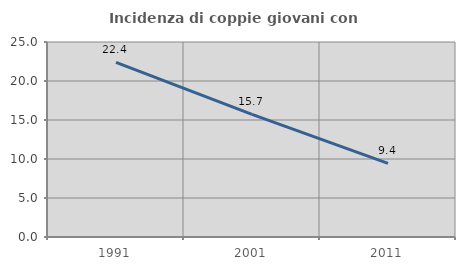
| Category | Incidenza di coppie giovani con figli |
|---|---|
| 1991.0 | 22.387 |
| 2001.0 | 15.72 |
| 2011.0 | 9.431 |